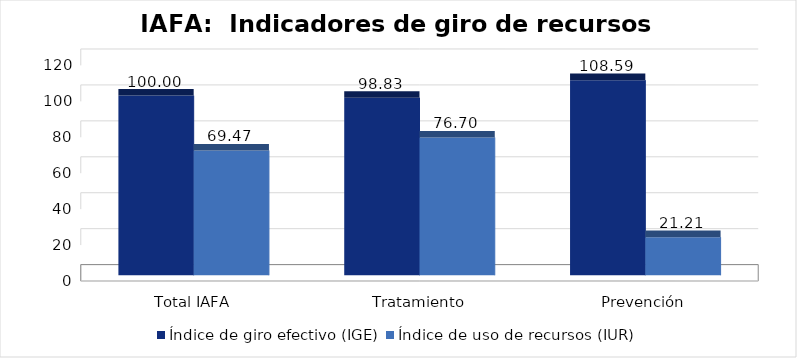
| Category | Índice de giro efectivo (IGE) | Índice de uso de recursos (IUR)  |
|---|---|---|
| Total IAFA | 100 | 69.474 |
| Tratamiento | 98.829 | 76.7 |
| Prevención | 108.593 | 21.213 |